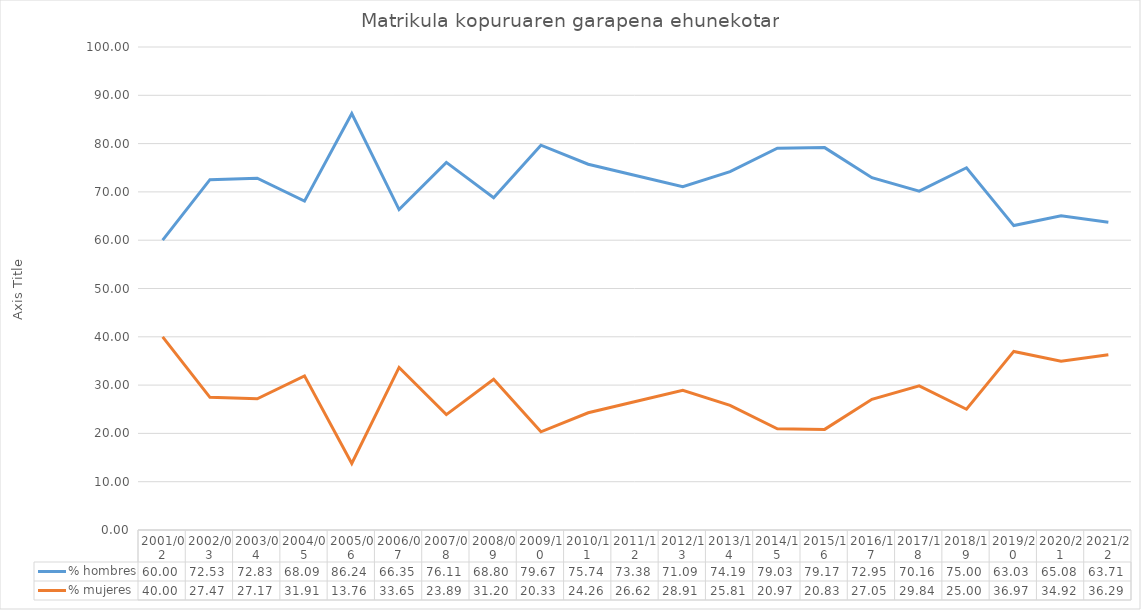
| Category | % hombres | % mujeres |
|---|---|---|
| 2001/02 | 60 | 40 |
| 2002/03 | 72.527 | 27.473 |
| 2003/04 | 72.826 | 27.174 |
| 2004/05 | 68.085 | 31.915 |
| 2005/06 | 86.239 | 13.761 |
| 2006/07 | 66.346 | 33.654 |
| 2007/08 | 76.106 | 23.894 |
| 2008/09 | 68.8 | 31.2 |
| 2009/10 | 79.675 | 20.325 |
| 2010/11 | 75.735 | 24.265 |
| 2011/12 | 73.381 | 26.619 |
| 2012/13 | 71.094 | 28.906 |
| 2013/14 | 74.194 | 25.806 |
| 2014/15 | 79.032 | 20.968 |
| 2015/16 | 79.167 | 20.833 |
| 2016/17 | 72.951 | 27.049 |
| 2017/18 | 70.161 | 29.839 |
| 2018/19 | 75 | 25 |
| 2019/20 | 63.025 | 36.975 |
| 2020/21 | 65.079 | 34.921 |
| 2021/22 | 63.71 | 36.29 |